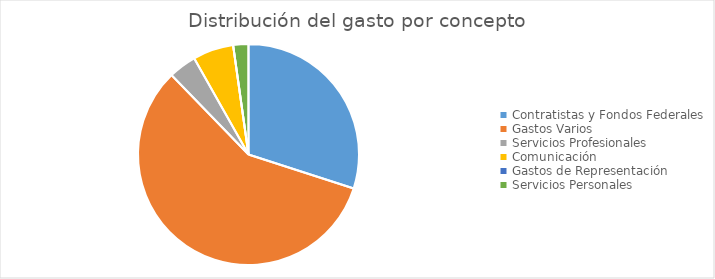
| Category | Series 0 |
|---|---|
| Contratistas y Fondos Federales | 172671518.05 |
| Gastos Varios | 332869241.69 |
| Servicios Profesionales | 23458488.86 |
| Comunicación | 34285683.73 |
| Gastos de Representación | 12000 |
| Servicios Personales | 12830214.34 |